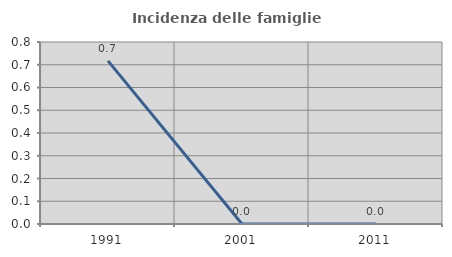
| Category | Incidenza delle famiglie numerose |
|---|---|
| 1991.0 | 0.717 |
| 2001.0 | 0 |
| 2011.0 | 0 |